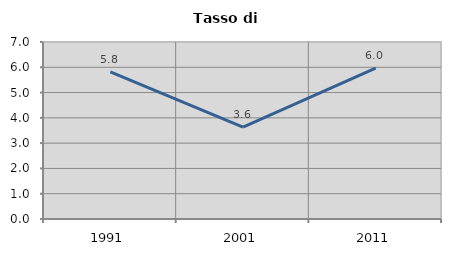
| Category | Tasso di disoccupazione   |
|---|---|
| 1991.0 | 5.817 |
| 2001.0 | 3.632 |
| 2011.0 | 5.97 |